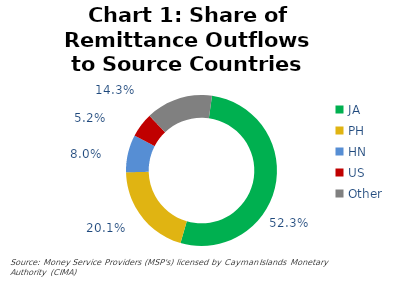
| Category | Chart 1: Share of Remittance Outflows to Source Countries 2022Q1 |
|---|---|
| JA | 0.523 |
| PH | 0.201 |
| HN | 0.08 |
| US | 0.052 |
| Other | 0.143 |